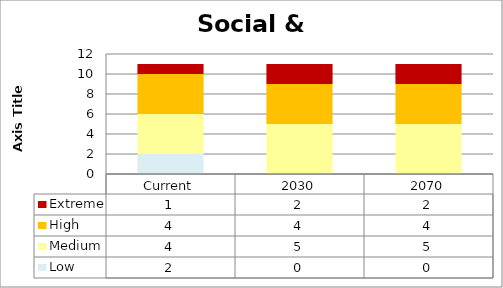
| Category | Low | Medium | High | Extreme |
|---|---|---|---|---|
| Current | 2 | 4 | 4 | 1 |
| 2030 | 0 | 5 | 4 | 2 |
| 2070 | 0 | 5 | 4 | 2 |